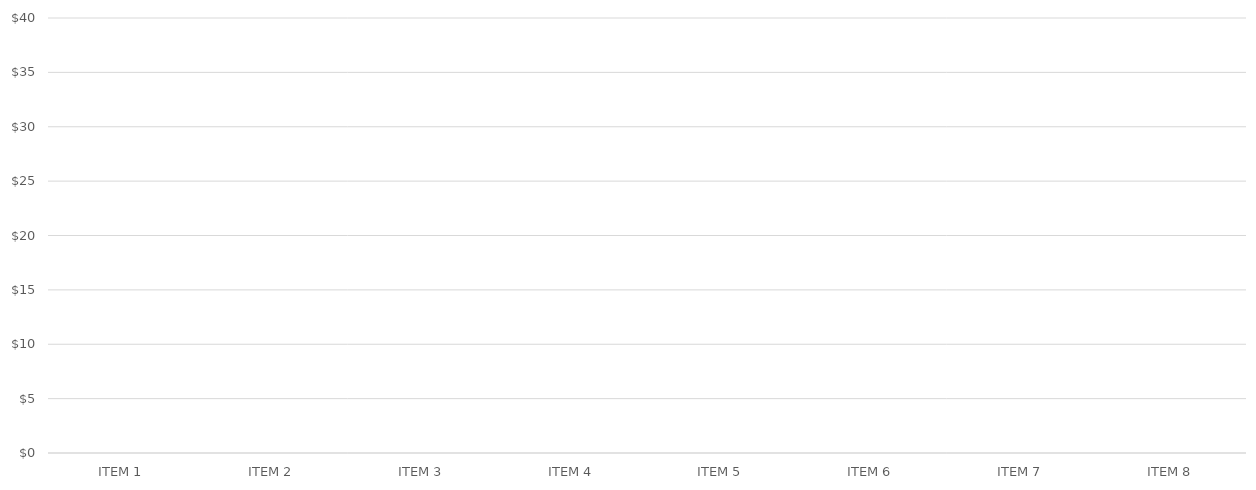
| Category | PROFIT PER ITEM |
|---|---|
| ITEM 1 | 0 |
| ITEM 2 | 0 |
| ITEM 3 | 0 |
| ITEM 4 | 0 |
| ITEM 5 | 0 |
| ITEM 6 | 0 |
| ITEM 7 | 0 |
| ITEM 8 | 0 |